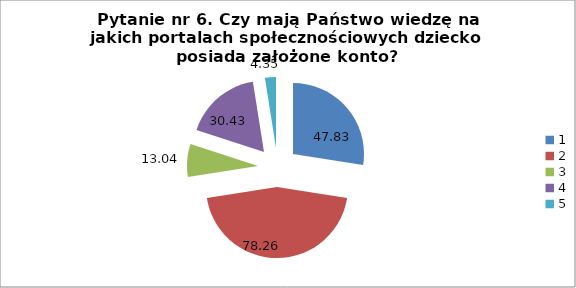
| Category | % |
|---|---|
| 0 | 47.826 |
| 1 | 78.261 |
| 2 | 13.043 |
| 3 | 30.435 |
| 4 | 4.348 |